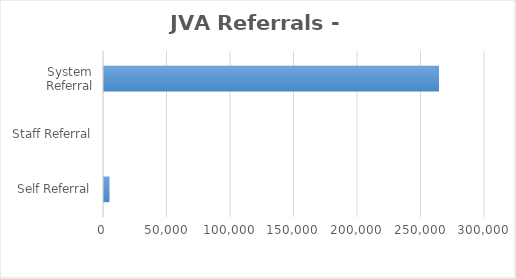
| Category | Series 0 |
|---|---|
| Self Referral | 4338 |
| Staff Referral | 0 |
| System Referral | 263784 |